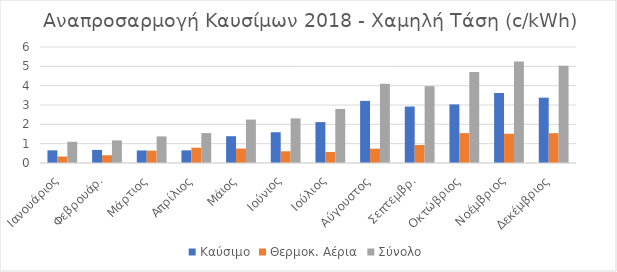
| Category | Καύσιμο | Θερμοκ. Αέρια | Σύνολο |
|---|---|---|---|
| Ιανουάριος | 0.654 | 0.335 | 1.098 |
| Φεβρουάρ. | 0.679 | 0.401 | 1.17 |
| Μάρτιος | 0.65 | 0.64 | 1.376 |
| Απρίλιος | 0.653 | 0.79 | 1.547 |
| Μάιος | 1.385 | 0.745 | 2.246 |
| Ιούνιος | 1.591 | 0.606 | 2.307 |
| Ιούλιος | 2.116 | 0.571 | 2.795 |
| Αύγουστος | 3.213 | 0.74 | 4.099 |
| Σεπτεμβρ. | 2.92 | 0.929 | 3.973 |
| Οκτώβριος | 3.031 | 1.544 | 4.71 |
| Νοέμβριος | 3.621 | 1.514 | 5.251 |
| Δεκέμβριος | 3.38 | 1.542 | 5.03 |